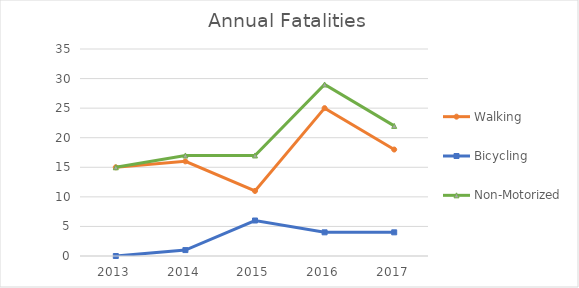
| Category | Walking | Bicycling | Non-Motorized |
|---|---|---|---|
| 2013 | 15 | 0 | 15 |
| 2014 | 16 | 1 | 17 |
| 2015 | 11 | 6 | 17 |
| 2016 | 25 | 4 | 29 |
| 2017 | 18 | 4 | 22 |